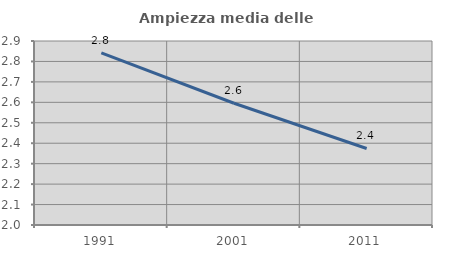
| Category | Ampiezza media delle famiglie |
|---|---|
| 1991.0 | 2.842 |
| 2001.0 | 2.596 |
| 2011.0 | 2.374 |